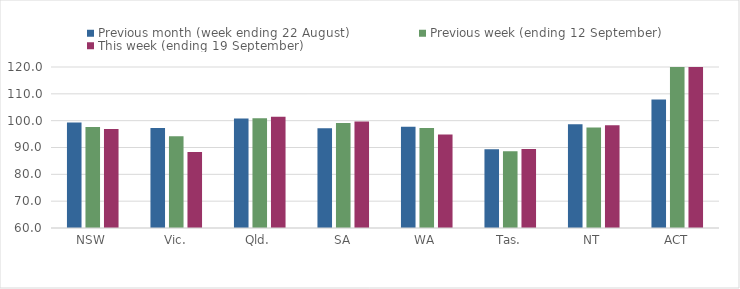
| Category | Previous month (week ending 22 August) | Previous week (ending 12 September) | This week (ending 19 September) |
|---|---|---|---|
| NSW | 99.33 | 97.66 | 96.88 |
| Vic. | 97.23 | 94.18 | 88.36 |
| Qld. | 100.81 | 100.91 | 101.42 |
| SA | 97.2 | 99.11 | 99.72 |
| WA | 97.76 | 97.27 | 94.81 |
| Tas. | 89.37 | 88.61 | 89.42 |
| NT | 98.7 | 97.41 | 98.25 |
| ACT | 107.89 | 121.05 | 120.79 |